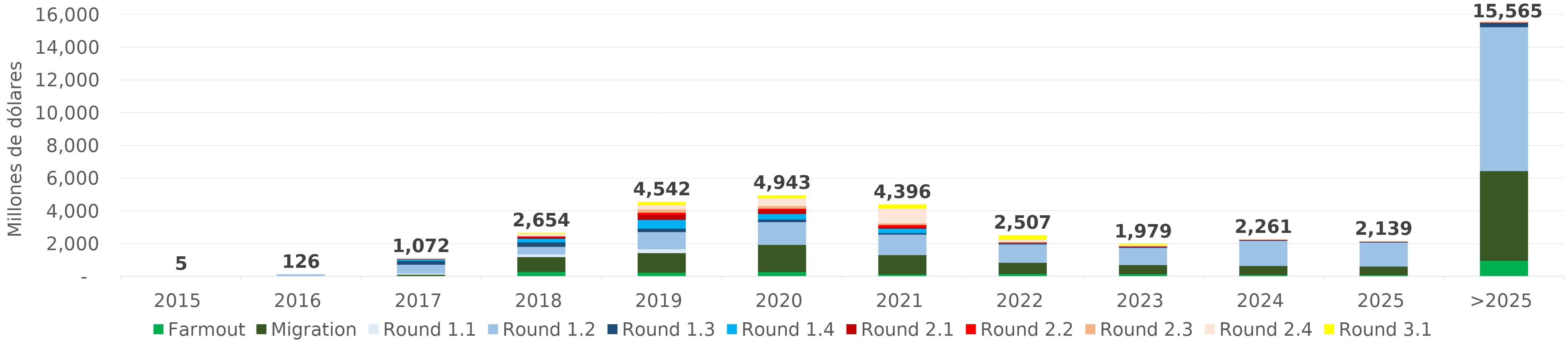
| Category | Farmout | Migration | Round 1.1 | Round 1.2 | Round 1.3 | Round 1.4 | Round 2.1 | Round 2.2 | Round 2.3 | Round 2.4 | Round 3.1 |
|---|---|---|---|---|---|---|---|---|---|---|---|
| 2015 | 0 | 0 | 4.573 | 0.236 | 0 | 0 | 0 | 0 | 0 | 0 | 0 |
| 2016 | 0 | 0 | 16.79 | 108.909 | 0 | 0 | 0 | 0 | 0 | 0 | 0 |
| 2017 | 50.877 | 65.422 | 76.429 | 533.486 | 231.789 | 93.443 | 18.851 | 1.29 | 0.72 | 0 | 0 |
| 2018 | 289.394 | 902.921 | 155.042 | 470.128 | 278.302 | 226.903 | 104.896 | 21.902 | 26.974 | 139.641 | 37.691 |
| 2019 | 241.207 | 1195.818 | 236.68 | 1049.68 | 207.126 | 540.649 | 302.09 | 133.009 | 199.161 | 270.262 | 166.186 |
| 2020 | 284.321 | 1655.641 | 6.736 | 1382.287 | 161.213 | 341.057 | 252.645 | 70.216 | 163.112 | 477.469 | 148.013 |
| 2021 | 127.797 | 1192.243 | 2.229 | 1245.799 | 90.024 | 274.593 | 106.762 | 117.22 | 97.175 | 902.96 | 238.989 |
| 2022 | 156.368 | 689.457 | 0 | 1116.823 | 55.367 | 10.69 | 22.691 | 31.916 | 30.541 | 142.246 | 250.81 |
| 2023 | 147.065 | 555.219 | 0 | 1053.188 | 52.504 | 0.73 | 0.019 | 37.005 | 21.555 | 47.441 | 63.845 |
| 2024 | 95.997 | 553.791 | 0 | 1533.703 | 34.867 | 0 | 0 | 27.408 | 14.136 | 1.529 | 0 |
| 2025 | 85.063 | 530.69 | 0 | 1469.047 | 35.989 | 0 | 0 | 10.138 | 8.511 | 0 | 0 |
| >2025 | 967.234 | 5485.433 | 0 | 8797.137 | 255.34 | 0 | 0 | 24.866 | 34.959 | 0 | 0 |